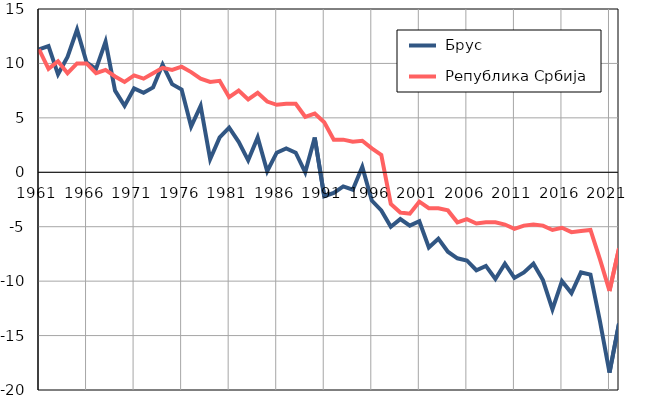
| Category |  Брус |  Република Србија |
|---|---|---|
| 1961.0 | 11.3 | 11.3 |
| 1962.0 | 11.6 | 9.5 |
| 1963.0 | 9 | 10.2 |
| 1964.0 | 10.6 | 9.1 |
| 1965.0 | 13.1 | 10 |
| 1966.0 | 10.1 | 10 |
| 1967.0 | 9.5 | 9.1 |
| 1968.0 | 12 | 9.4 |
| 1969.0 | 7.5 | 8.8 |
| 1970.0 | 6.1 | 8.3 |
| 1971.0 | 7.7 | 8.9 |
| 1972.0 | 7.3 | 8.6 |
| 1973.0 | 7.8 | 9.1 |
| 1974.0 | 9.9 | 9.6 |
| 1975.0 | 8.1 | 9.4 |
| 1976.0 | 7.6 | 9.7 |
| 1977.0 | 4.2 | 9.2 |
| 1978.0 | 6.1 | 8.6 |
| 1979.0 | 1.2 | 8.3 |
| 1980.0 | 3.2 | 8.4 |
| 1981.0 | 4.1 | 6.9 |
| 1982.0 | 2.8 | 7.5 |
| 1983.0 | 1.1 | 6.7 |
| 1984.0 | 3.2 | 7.3 |
| 1985.0 | 0.1 | 6.5 |
| 1986.0 | 1.8 | 6.2 |
| 1987.0 | 2.2 | 6.3 |
| 1988.0 | 1.8 | 6.3 |
| 1989.0 | 0 | 5.1 |
| 1990.0 | 3.2 | 5.4 |
| 1991.0 | -2.2 | 4.6 |
| 1992.0 | -1.9 | 3 |
| 1993.0 | -1.3 | 3 |
| 1994.0 | -1.6 | 2.8 |
| 1995.0 | 0.5 | 2.9 |
| 1996.0 | -2.6 | 2.2 |
| 1997.0 | -3.5 | 1.6 |
| 1998.0 | -5 | -2.9 |
| 1999.0 | -4.3 | -3.7 |
| 2000.0 | -4.9 | -3.8 |
| 2001.0 | -4.5 | -2.7 |
| 2002.0 | -6.9 | -3.3 |
| 2003.0 | -6.1 | -3.3 |
| 2004.0 | -7.3 | -3.5 |
| 2005.0 | -7.9 | -4.6 |
| 2006.0 | -8.1 | -4.3 |
| 2007.0 | -9 | -4.7 |
| 2008.0 | -8.6 | -4.6 |
| 2009.0 | -9.8 | -4.6 |
| 2010.0 | -8.4 | -4.8 |
| 2011.0 | -9.7 | -5.2 |
| 2012.0 | -9.2 | -4.9 |
| 2013.0 | -8.4 | -4.8 |
| 2014.0 | -9.9 | -4.9 |
| 2015.0 | -12.6 | -5.3 |
| 2016.0 | -10 | -5.1 |
| 2017.0 | -11.1 | -5.5 |
| 2018.0 | -9.2 | -5.4 |
| 2019.0 | -9.4 | -5.3 |
| 2020.0 | -13.7 | -8 |
| 2021.0 | -18.4 | -10.9 |
| 2022.0 | -13.9 | -7 |